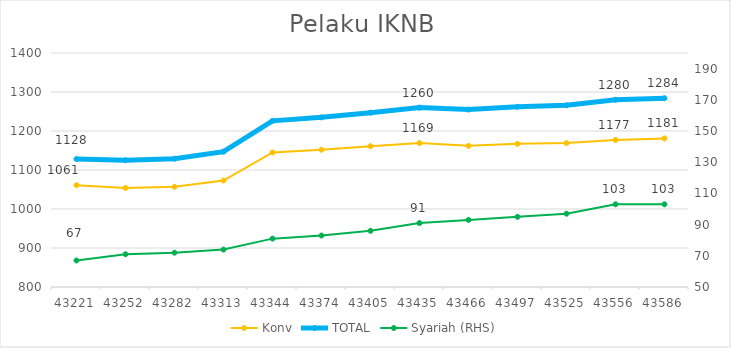
| Category | Konv | TOTAL |
|---|---|---|
| 2018-05-01 | 1061 | 1128 |
| 2018-06-01 | 1054 | 1125 |
| 2018-07-01 | 1057 | 1129 |
| 2018-08-01 | 1073 | 1147 |
| 2018-09-01 | 1145 | 1226 |
| 2018-10-01 | 1152 | 1235 |
| 2018-11-01 | 1161 | 1247 |
| 2018-12-01 | 1169 | 1260 |
| 2019-01-01 | 1162 | 1255 |
| 2019-02-01 | 1167 | 1262 |
| 2019-03-01 | 1169 | 1266 |
| 2019-04-01 | 1177 | 1280 |
| 2019-05-01 | 1181 | 1284 |